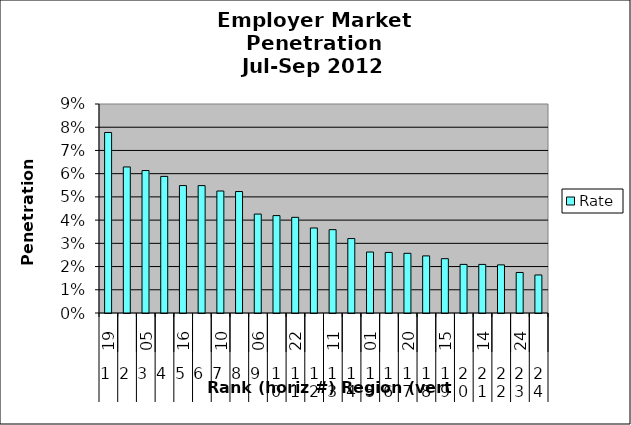
| Category | Rate |
|---|---|
| 0 | 0.078 |
| 1 | 0.063 |
| 2 | 0.061 |
| 3 | 0.059 |
| 4 | 0.055 |
| 5 | 0.055 |
| 6 | 0.053 |
| 7 | 0.052 |
| 8 | 0.043 |
| 9 | 0.042 |
| 10 | 0.041 |
| 11 | 0.037 |
| 12 | 0.036 |
| 13 | 0.032 |
| 14 | 0.026 |
| 15 | 0.026 |
| 16 | 0.026 |
| 17 | 0.025 |
| 18 | 0.023 |
| 19 | 0.021 |
| 20 | 0.021 |
| 21 | 0.021 |
| 22 | 0.017 |
| 23 | 0.016 |